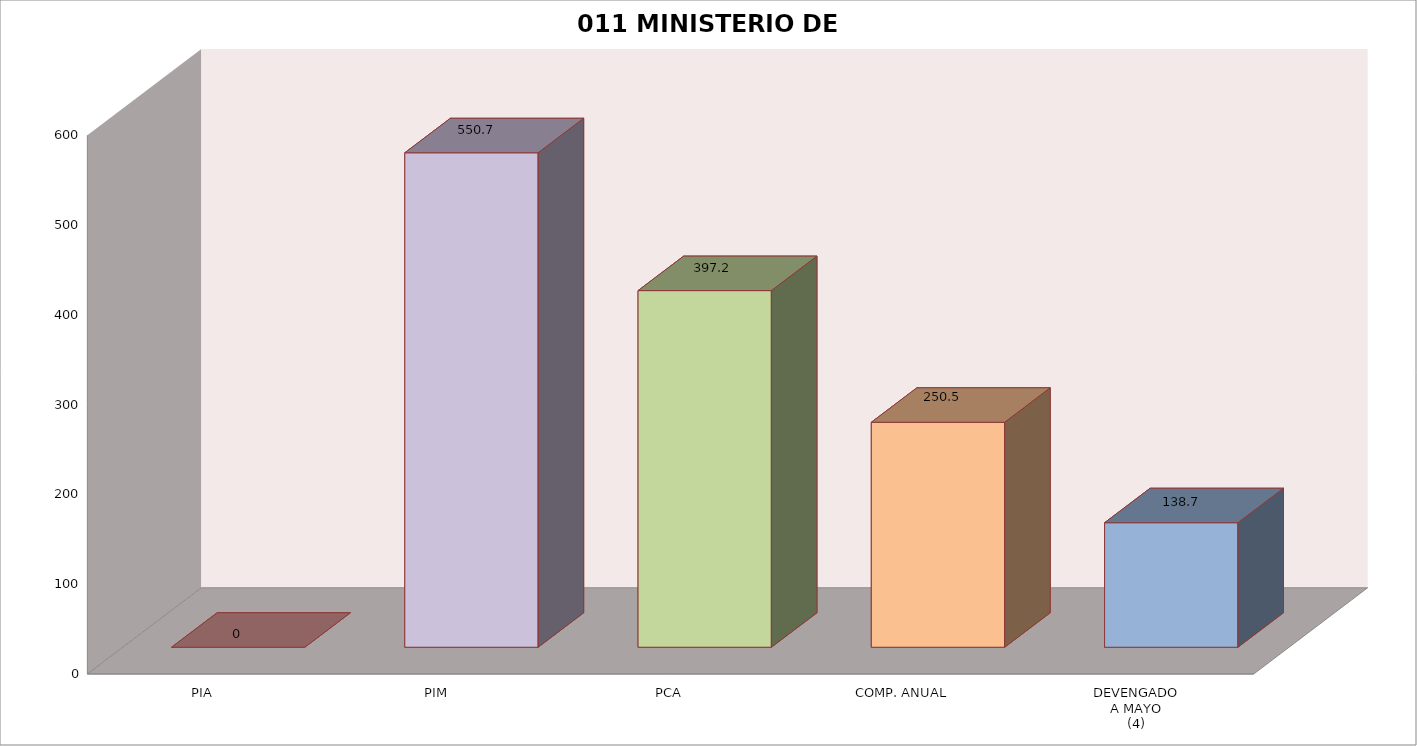
| Category | 011 MINISTERIO DE SALUD |
|---|---|
| PIA | 0 |
| PIM | 550.693 |
| PCA | 397.2 |
| COMP. ANUAL | 250.534 |
| DEVENGADO
A MAYO
(4) | 138.684 |